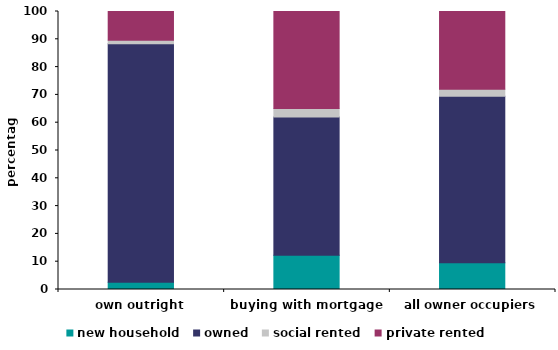
| Category | new household | owned | social rented | private rented |
|---|---|---|---|---|
| own outright | 2.651 | 85.722 | 1.297 | 10.329 |
| buying with mortgage | 12.36 | 49.719 | 3.051 | 34.869 |
| all owner occupiers | 9.618 | 59.888 | 2.556 | 27.938 |